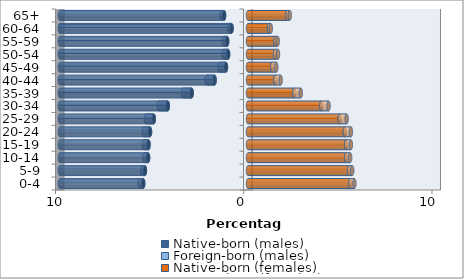
| Category | Native-born (males) | Foreign-born (males) | Native-born (females) | Foreign-born (females) |
|---|---|---|---|---|
| 0-4 | -5.564 | -0.194 | 5.426 | 0.225 |
| 5-9 | -5.475 | -0.154 | 5.365 | 0.174 |
| 10-14 | -5.308 | -0.197 | 5.211 | 0.215 |
| 15-19 | -5.285 | -0.247 | 5.21 | 0.253 |
| 20-24 | -5.204 | -0.339 | 5.142 | 0.323 |
| 25-29 | -5.004 | -0.423 | 4.872 | 0.368 |
| 30-34 | -4.258 | -0.482 | 3.898 | 0.38 |
| 35-39 | -2.989 | -0.474 | 2.462 | 0.341 |
| 40-44 | -1.774 | -0.425 | 1.45 | 0.284 |
| 45-49 | -1.171 | -0.338 | 1.287 | 0.217 |
| 50-54 | -1.057 | -0.249 | 1.436 | 0.157 |
| 55-59 | -1.107 | -0.18 | 1.458 | 0.121 |
| 60-64 | -0.871 | -0.129 | 1.112 | 0.098 |
| 65+ | -1.27 | -0.129 | 2.09 | 0.13 |